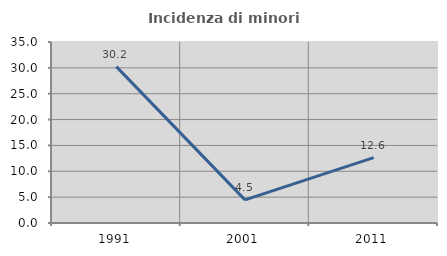
| Category | Incidenza di minori stranieri |
|---|---|
| 1991.0 | 30.233 |
| 2001.0 | 4.478 |
| 2011.0 | 12.632 |